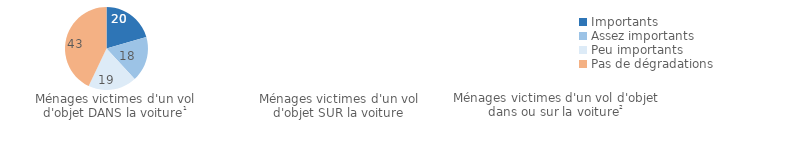
| Category | Series 0 |
|---|---|
| Importants | 20.484 |
| Assez importants | 17.623 |
| Peu importants | 18.92 |
| Pas de dégradations | 42.897 |